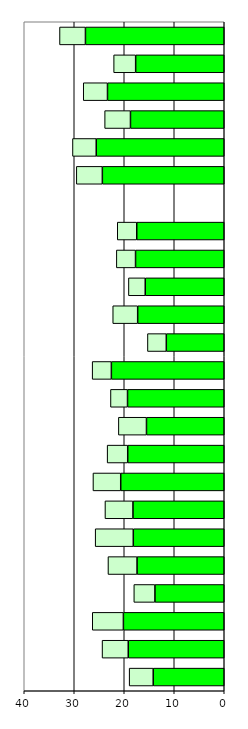
| Category | Series 0 | Series 1 |
|---|---|---|
| 0 | 14.207 | 4.81 |
| 1 | 19.2 | 5.236 |
| 2 | 20.171 | 6.226 |
| 3 | 13.864 | 4.219 |
| 4 | 17.442 | 5.814 |
| 5 | 18.192 | 7.623 |
| 6 | 18.258 | 5.599 |
| 7 | 20.706 | 5.553 |
| 8 | 19.305 | 4.114 |
| 9 | 15.556 | 5.617 |
| 10 | 19.347 | 3.41 |
| 11 | 22.575 | 3.843 |
| 12 | 11.588 | 3.773 |
| 13 | 17.314 | 4.989 |
| 14 | 15.802 | 3.362 |
| 15 | 17.742 | 3.836 |
| 16 | 17.499 | 3.9 |
| 17 | 0 | 0 |
| 18 | 24.379 | 5.207 |
| 19 | 25.603 | 4.753 |
| 20 | 18.756 | 5.165 |
| 21 | 23.351 | 4.85 |
| 22 | 17.718 | 4.403 |
| 23 | 27.759 | 5.187 |